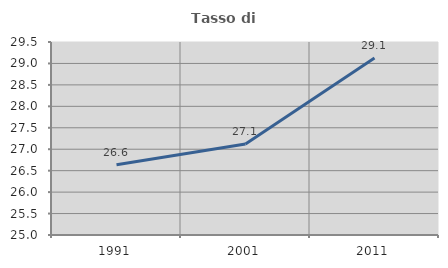
| Category | Tasso di occupazione   |
|---|---|
| 1991.0 | 26.636 |
| 2001.0 | 27.12 |
| 2011.0 | 29.128 |